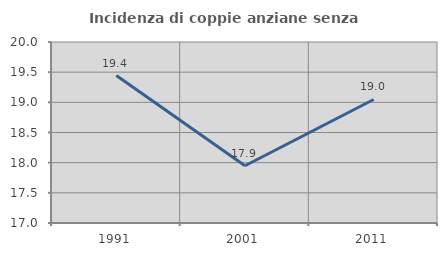
| Category | Incidenza di coppie anziane senza figli  |
|---|---|
| 1991.0 | 19.444 |
| 2001.0 | 17.949 |
| 2011.0 | 19.048 |